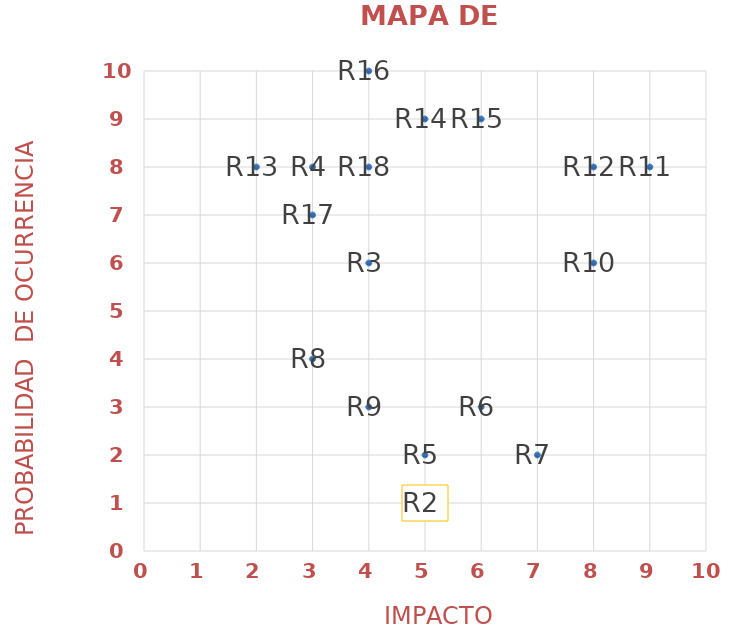
| Category | R1 |
|---|---|
| nan | 1 |
| 5.0 | 1 |
| 4.0 | 6 |
| 3.0 | 8 |
| 5.0 | 2 |
| 6.0 | 3 |
| 7.0 | 2 |
| 3.0 | 4 |
| 4.0 | 3 |
| 8.0 | 6 |
| 9.0 | 8 |
| 8.0 | 8 |
| 2.0 | 8 |
| 5.0 | 9 |
| 6.0 | 9 |
| 4.0 | 10 |
| 3.0 | 7 |
| 4.0 | 8 |